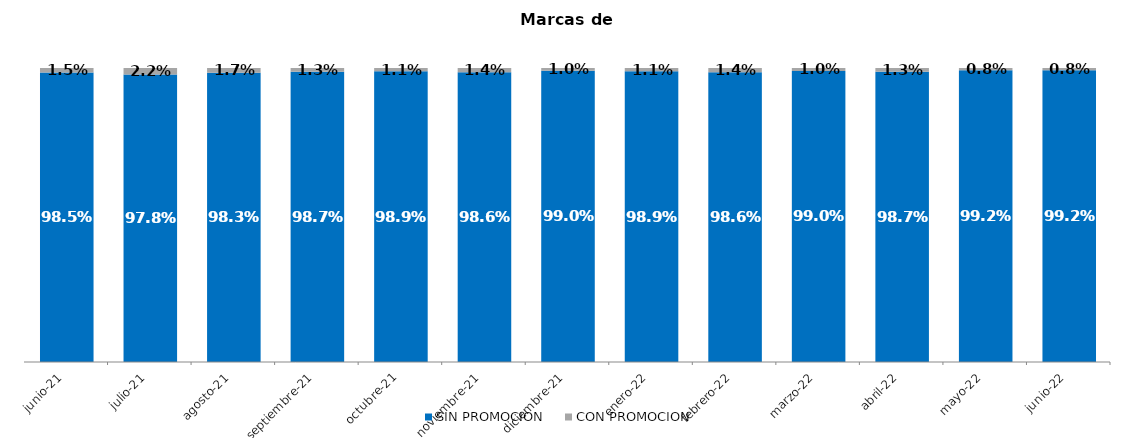
| Category | SIN PROMOCION   | CON PROMOCION   |
|---|---|---|
| 2021-06-01 | 0.985 | 0.015 |
| 2021-07-01 | 0.978 | 0.022 |
| 2021-08-01 | 0.983 | 0.017 |
| 2021-09-01 | 0.987 | 0.013 |
| 2021-10-01 | 0.989 | 0.011 |
| 2021-11-01 | 0.986 | 0.014 |
| 2021-12-01 | 0.99 | 0.01 |
| 2022-01-01 | 0.989 | 0.011 |
| 2022-02-01 | 0.986 | 0.014 |
| 2022-03-01 | 0.99 | 0.01 |
| 2022-04-01 | 0.987 | 0.013 |
| 2022-05-01 | 0.992 | 0.008 |
| 2022-06-01 | 0.992 | 0.008 |